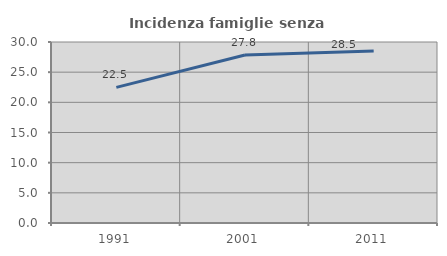
| Category | Incidenza famiglie senza nuclei |
|---|---|
| 1991.0 | 22.485 |
| 2001.0 | 27.839 |
| 2011.0 | 28.501 |